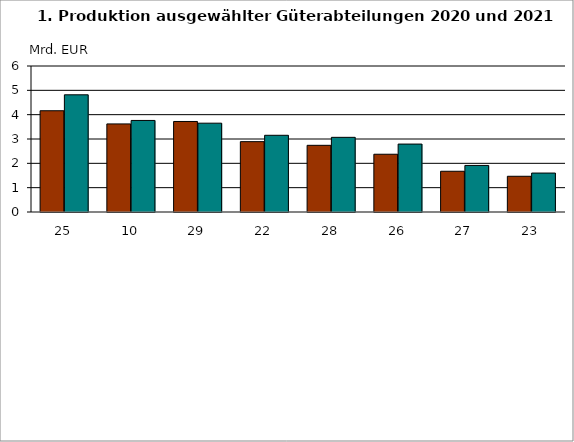
| Category | Series 0 | Series 1 |
|---|---|---|
| 25.0 | 4.161 | 4.816 |
| 10.0 | 3.62 | 3.763 |
| 29.0 | 3.72 | 3.65 |
| 22.0 | 2.891 | 3.153 |
| 28.0 | 2.74 | 3.068 |
| 26.0 | 2.374 | 2.791 |
| 27.0 | 1.674 | 1.914 |
| 23.0 | 1.468 | 1.6 |